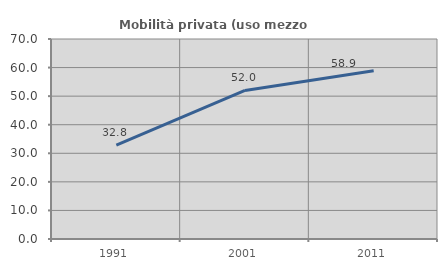
| Category | Mobilità privata (uso mezzo privato) |
|---|---|
| 1991.0 | 32.818 |
| 2001.0 | 52.003 |
| 2011.0 | 58.916 |